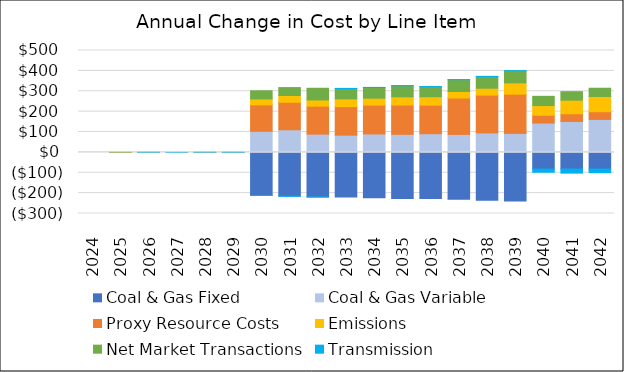
| Category | Coal & Gas Fixed | Coal & Gas Variable | Proxy Resource Costs | Emissions | Net Market Transactions | Transmission |
|---|---|---|---|---|---|---|
| 2024.0 | 0 | 0 | 0 | 0 | 0 | 0 |
| 2025.0 | 0 | 0.01 | 0 | -0.001 | -0.014 | 0 |
| 2026.0 | 0 | 0.055 | -0.001 | 0.017 | 0.279 | 0 |
| 2027.0 | 0 | 0 | 0 | 0 | 0 | 0 |
| 2028.0 | 0 | -0.339 | 0.006 | -0.086 | 0.414 | 0 |
| 2029.0 | 0 | 0.169 | -0.831 | 0.006 | 0.132 | 0 |
| 2030.0 | -211.051 | 103.482 | 129.641 | 29.203 | 40.142 | -0.038 |
| 2031.0 | -214.95 | 111.068 | 134.846 | 33.208 | 38.9 | -0.439 |
| 2032.0 | -218.879 | 89.472 | 137.168 | 30.661 | 57.336 | -0.241 |
| 2033.0 | -218.879 | 84.453 | 140.124 | 38.064 | 50.797 | 0.547 |
| 2034.0 | -222.807 | 90.36 | 141.518 | 34.218 | 52.243 | 0.557 |
| 2035.0 | -226.706 | 88.706 | 143.498 | 40.581 | 54.18 | 0.567 |
| 2036.0 | -226.706 | 91.561 | 140.137 | 41.239 | 49.41 | 0.577 |
| 2037.0 | -230.634 | 88.344 | 178.514 | 31.785 | 58.066 | 0.3 |
| 2038.0 | -234.533 | 95.447 | 185.688 | 33.81 | 57.595 | 0.445 |
| 2039.0 | -238.461 | 93.042 | 192.582 | 55.549 | 59.2 | 0.486 |
| 2040.0 | -81.8 | 143.901 | 38.432 | 47.446 | 45.342 | -15.775 |
| 2041.0 | -81.8 | 151.876 | 37.493 | 66.809 | 41.792 | -20.039 |
| 2042.0 | -81.8 | 161.682 | 37.929 | 74.778 | 40.476 | -17.583 |